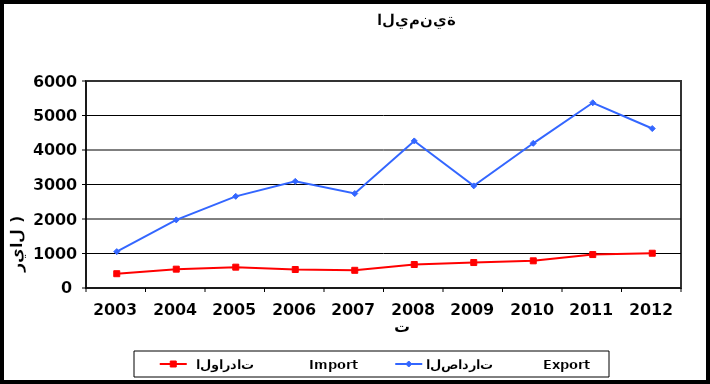
| Category |  الواردات           Import | الصادرات          Export |
|---|---|---|
| 2003.0 | 414 | 1055 |
| 2004.0 | 546 | 1974 |
| 2005.0 | 604 | 2657 |
| 2006.0 | 536 | 3091 |
| 2007.0 | 513 | 2738 |
| 2008.0 | 681 | 4263 |
| 2009.0 | 738 | 2961 |
| 2010.0 | 788 | 4194 |
| 2011.0 | 969 | 5369 |
| 2012.0 | 1008 | 4622 |